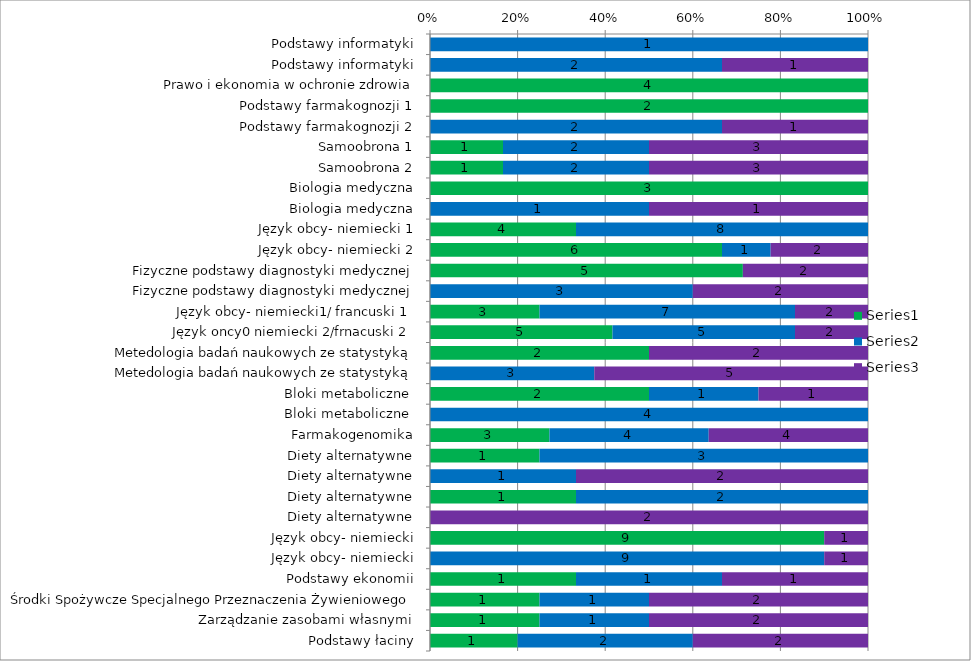
| Category | Series 0 | Series 1 | Series 2 |
|---|---|---|---|
| Podstawy informatyki | 0 | 1 | 0 |
| Podstawy informatyki | 0 | 2 | 1 |
| Prawo i ekonomia w ochronie zdrowia | 4 | 0 | 0 |
| Podstawy farmakognozji 1 | 2 | 0 | 0 |
| Podstawy farmakognozji 2 | 0 | 2 | 1 |
| Samoobrona 1 | 1 | 2 | 3 |
| Samoobrona 2 | 1 | 2 | 3 |
| Biologia medyczna | 3 | 0 | 0 |
| Biologia medyczna | 0 | 1 | 1 |
| Język obcy- niemiecki 1 | 4 | 8 | 0 |
|  Język obcy- niemiecki 2 | 6 | 1 | 2 |
| Fizyczne podstawy diagnostyki medycznej | 5 | 0 | 2 |
| Fizyczne podstawy diagnostyki medycznej | 0 | 3 | 2 |
| Język obcy- niemiecki1/ francuski 1  | 3 | 7 | 2 |
| Język oncy0 niemiecki 2/frnacuski 2  | 5 | 5 | 2 |
| Metedologia badań naukowych ze statystyką | 2 | 0 | 2 |
| Metedologia badań naukowych ze statystyką | 0 | 3 | 5 |
| Bloki metaboliczne  | 2 | 1 | 1 |
| Bloki metaboliczne  | 0 | 4 | 0 |
| Farmakogenomika | 3 | 4 | 4 |
| Diety alternatywne | 1 | 3 | 0 |
| Diety alternatywne | 0 | 1 | 2 |
| Diety alternatywne | 1 | 2 | 0 |
| Diety alternatywne | 0 | 0 | 2 |
| Język obcy- niemiecki | 9 | 0 | 1 |
| Język obcy- niemiecki | 0 | 9 | 1 |
| Podstawy ekonomii | 1 | 1 | 1 |
| Środki Spożywcze Specjalnego Przeznaczenia Żywieniowego | 1 | 1 | 2 |
| Zarządzanie zasobami własnymi | 1 | 1 | 2 |
| Podstawy łaciny | 1 | 2 | 2 |